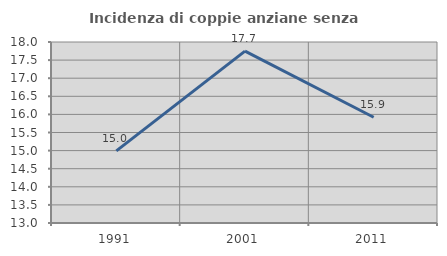
| Category | Incidenza di coppie anziane senza figli  |
|---|---|
| 1991.0 | 14.991 |
| 2001.0 | 17.748 |
| 2011.0 | 15.922 |